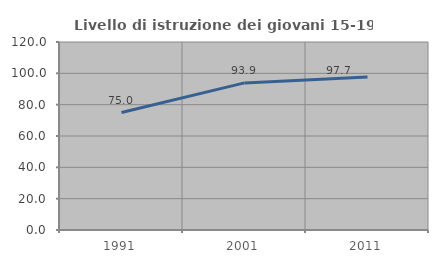
| Category | Livello di istruzione dei giovani 15-19 anni |
|---|---|
| 1991.0 | 74.952 |
| 2001.0 | 93.904 |
| 2011.0 | 97.652 |